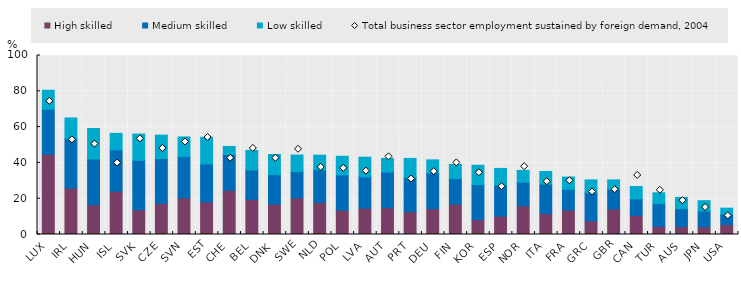
| Category | High skilled | Medium skilled | Low skilled |
|---|---|---|---|
| LUX | 44.8 | 25.2 | 10.6 |
| IRL | 25.9 | 27.6 | 11.6 |
| HUN | 16.6 | 25.6 | 17 |
| ISL | 24.2 | 23.1 | 9.2 |
| SVK | 13.8 | 27.6 | 14.7 |
| CZE | 17.3 | 25.1 | 13.1 |
| SVN | 20.4 | 23.1 | 11 |
| EST | 18.2 | 21.2 | 14.9 |
| CHE | 24.7 | 20 | 4.5 |
| BEL | 19.6 | 16.4 | 11 |
| DNK | 16.9 | 16.5 | 11.3 |
| SWE | 20.4 | 14.7 | 9.3 |
| NLD | 17.8 | 18.3 | 8.2 |
| POL | 13.6 | 19.7 | 10.4 |
| LVA | 14.7 | 17.5 | 11 |
| AUT | 15 | 19.9 | 7.6 |
| PRT | 12.7 | 19 | 10.8 |
| DEU | 14.4 | 20 | 7.3 |
| FIN | 16.9 | 14.3 | 7.9 |
| KOR | 8.3 | 19.6 | 10.8 |
| ESP | 10.3 | 17.3 | 9.3 |
| NOR | 16 | 13.2 | 6.6 |
| ITA | 11.7 | 16.4 | 7.1 |
| FRA | 13.7 | 11.6 | 6.8 |
| GRC | 7.6 | 15.7 | 7.2 |
| GBR | 14.2 | 11.1 | 5.2 |
| CAN | 10.7 | 9.2 | 6.9 |
| TUR | 4.5 | 12.8 | 6 |
| AUS | 4.4 | 10 | 6.3 |
| JPN | 4.3 | 8.8 | 5.8 |
| USA | 5.6 | 5.8 | 3.3 |